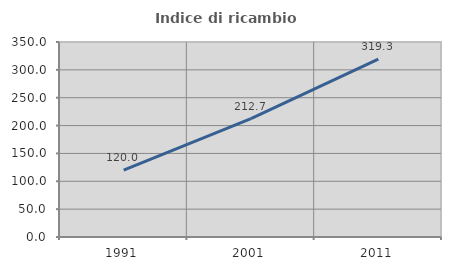
| Category | Indice di ricambio occupazionale  |
|---|---|
| 1991.0 | 120 |
| 2001.0 | 212.658 |
| 2011.0 | 319.298 |